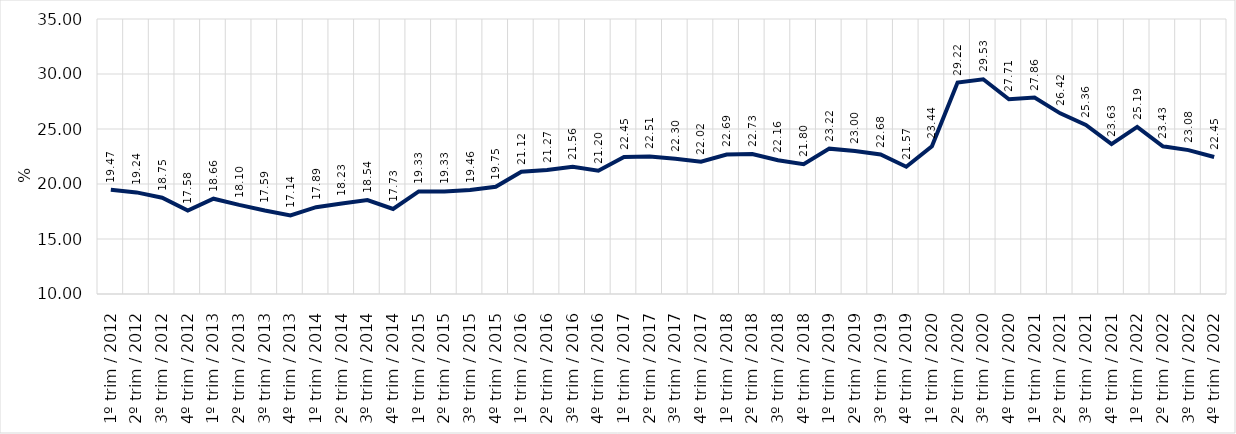
| Category | Series 0 |
|---|---|
| 1º trim / 2012 | 19.471 |
| 2º trim / 2012 | 19.236 |
| 3º trim / 2012 | 18.749 |
| 4º trim / 2012 | 17.579 |
| 1º trim / 2013 | 18.662 |
| 2º trim / 2013 | 18.098 |
| 3º trim / 2013 | 17.591 |
| 4º trim / 2013 | 17.141 |
| 1º trim / 2014 | 17.891 |
| 2º trim / 2014 | 18.23 |
| 3º trim / 2014 | 18.544 |
| 4º trim / 2014 | 17.732 |
| 1º trim / 2015 | 19.325 |
| 2º trim / 2015 | 19.326 |
| 3º trim / 2015 | 19.459 |
| 4º trim / 2015 | 19.746 |
| 1º trim / 2016 | 21.116 |
| 2º trim / 2016 | 21.274 |
| 3º trim / 2016 | 21.563 |
| 4º trim / 2016 | 21.203 |
| 1º trim / 2017 | 22.449 |
| 2º trim / 2017 | 22.508 |
| 3º trim / 2017 | 22.296 |
| 4º trim / 2017 | 22.019 |
| 1º trim / 2018 | 22.686 |
| 2º trim / 2018 | 22.729 |
| 3º trim / 2018 | 22.156 |
| 4º trim / 2018 | 21.799 |
| 1º trim / 2019 | 23.215 |
| 2º trim / 2019 | 22.998 |
| 3º trim / 2019 | 22.678 |
| 4º trim / 2019 | 21.573 |
| 1º trim / 2020 | 23.436 |
| 2º trim / 2020 | 29.224 |
| 3º trim / 2020 | 29.526 |
| 4º trim / 2020 | 27.706 |
| 1º trim / 2021 | 27.86 |
| 2º trim / 2021 | 26.424 |
| 3º trim / 2021 | 25.362 |
| 4º trim / 2021 | 23.628 |
| 1º trim / 2022 | 25.193 |
| 2º trim / 2022 | 23.432 |
| 3º trim / 2022 | 23.08 |
| 4º trim / 2022 | 22.453 |